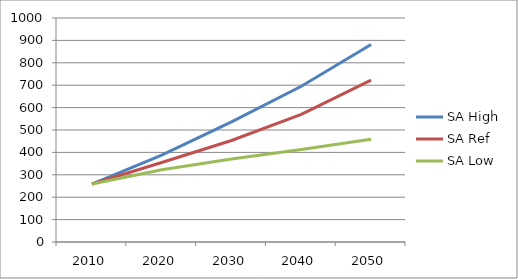
| Category | SA High | SA Ref | SA Low |
|---|---|---|---|
| 2010.0 | 258.87 | 258.87 | 258.87 |
| 2020.0 | 388.087 | 354.899 | 322.108 |
| 2030.0 | 536.341 | 453.069 | 370.211 |
| 2040.0 | 695.16 | 569.336 | 413.252 |
| 2050.0 | 881.855 | 722.24 | 458.22 |